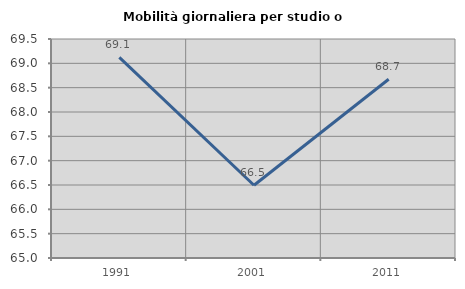
| Category | Mobilità giornaliera per studio o lavoro |
|---|---|
| 1991.0 | 69.122 |
| 2001.0 | 66.495 |
| 2011.0 | 68.673 |